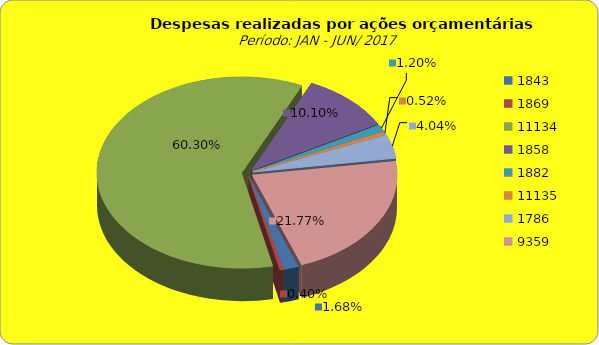
| Category | Series 1 |
|---|---|
| 1843.0 | 2265362.53 |
| 1869.0 | 538809.57 |
| 11134.0 | 81281830.62 |
| 1858.0 | 13620921.01 |
| 1882.0 | 1613100.27 |
| 11135.0 | 699938.25 |
| 1786.0 | 5439883.25 |
| 9359.0 | 29345825.44 |